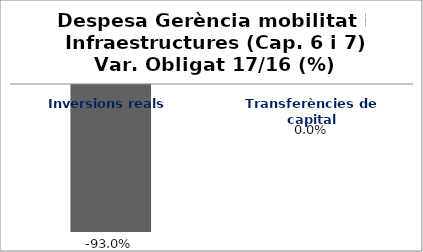
| Category | Series 0 |
|---|---|
| Inversions reals | -0.93 |
| Transferències de capital | 0 |